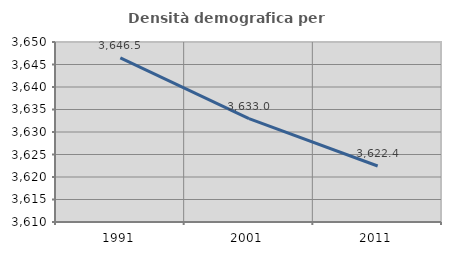
| Category | Densità demografica |
|---|---|
| 1991.0 | 3646.466 |
| 2001.0 | 3632.957 |
| 2011.0 | 3622.439 |